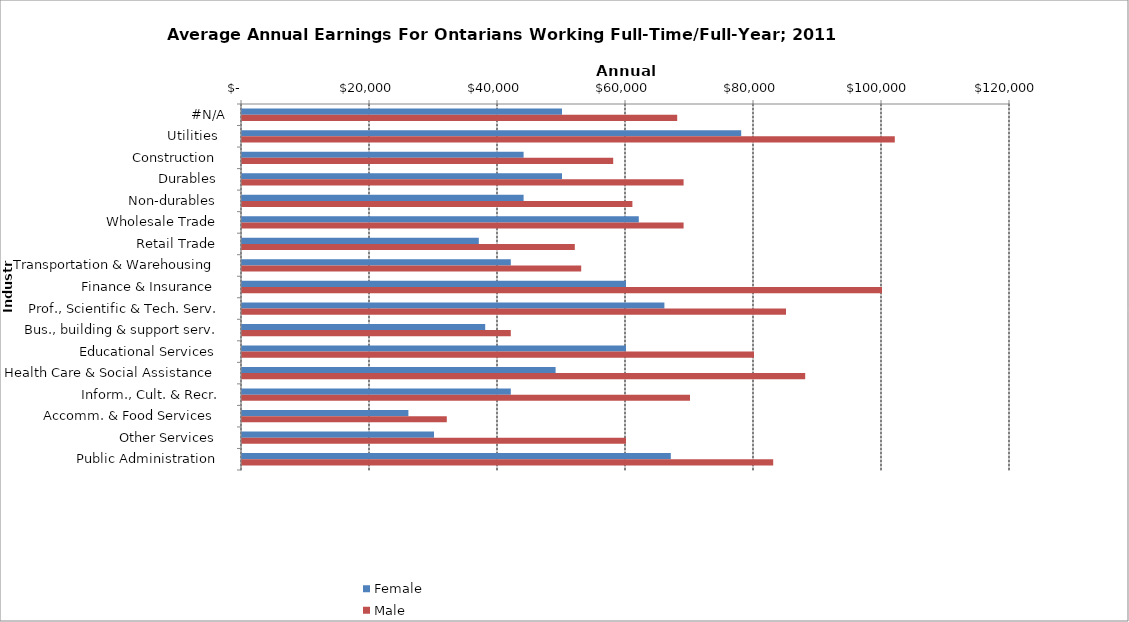
| Category | Female | Male |
|---|---|---|
|  #N/A  | 50000 | 68000 |
|  Utilities   | 78000 | 102000 |
|  Construction   | 44000 | 58000 |
|  Durables   | 50000 | 69000 |
|  Non-durables   | 44000 | 61000 |
|  Wholesale Trade   | 62000 | 69000 |
|  Retail Trade   | 37000 | 52000 |
|  Transportation & Warehousing   | 42000 | 53000 |
|  Finance & Insurance   | 60000 | 100000 |
|  Prof., Scientific & Tech. Serv.  | 66000 | 85000 |
|  Bus., building & support serv.  | 38000 | 42000 |
|  Educational Services   | 60000 | 80000 |
|  Health Care & Social Assistance   | 49000 | 88000 |
|  Inform., Cult. & Recr.  | 42000 | 70000 |
|  Accomm. & Food Services   | 26000 | 32000 |
|  Other Services   | 30000 | 60000 |
|  Public Administration   | 67000 | 83000 |